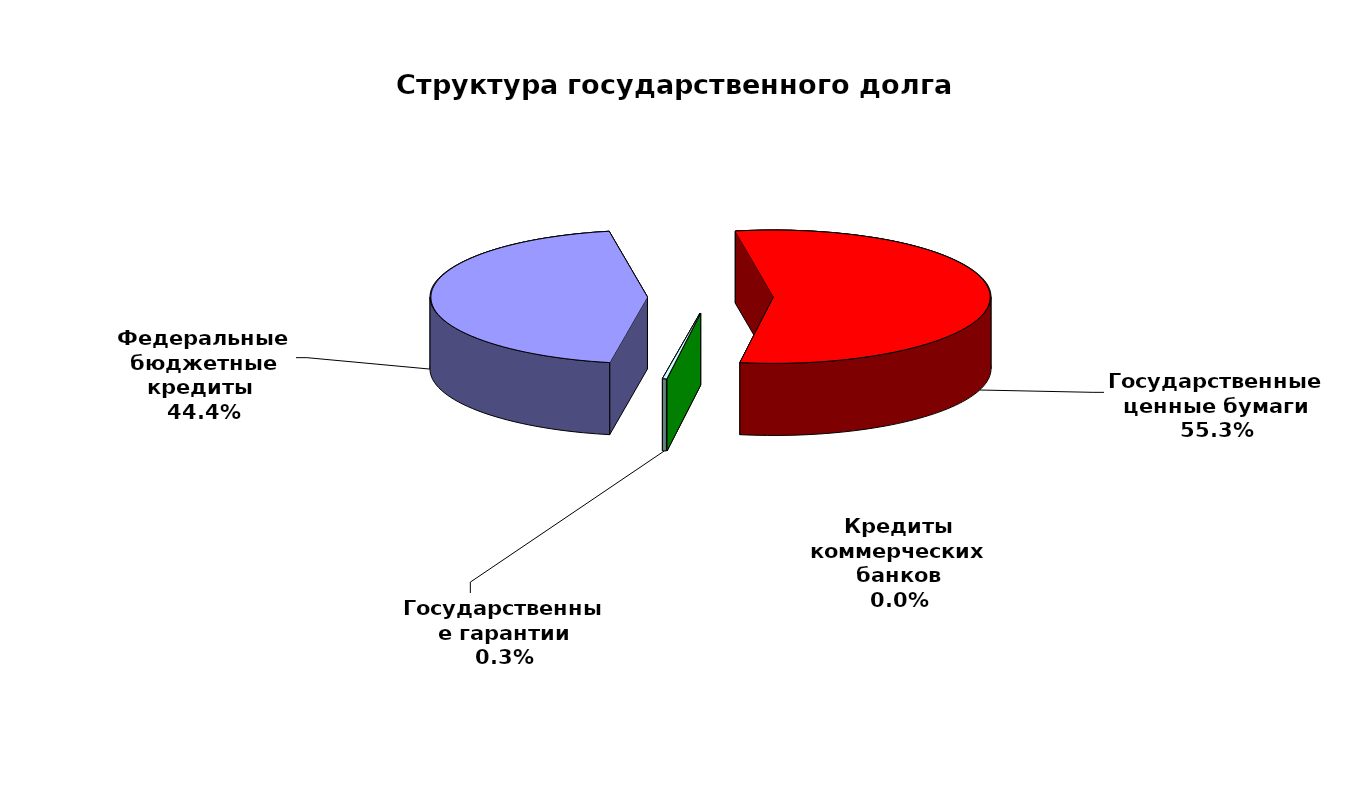
| Category | Series 0 |
|---|---|
| Федеральные бюджетные кредиты  | 27303300.463 |
| Государственные ценные бумаги | 34000000 |
| Кредиты коммерческих банков | 0 |
| Государственные гарантии | 184738.15 |